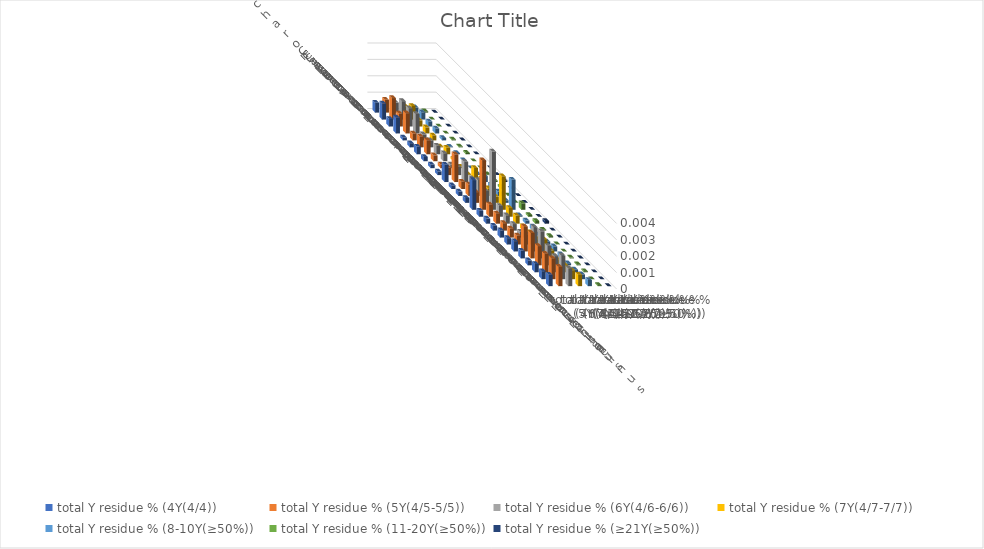
| Category | total Y residue % (4Y(4/4)) | total Y residue % (5Y(4/5-5/5)) | total Y residue % (6Y(4/6-6/6)) | total Y residue % (7Y(4/7-7/7)) | total Y residue % (8-10Y(≥50%)) | total Y residue % (11-20Y(≥50%)) | total Y residue % (≥21Y(≥50%)) |
|---|---|---|---|---|---|---|---|
| Saccharomyces cerevisiae S288c | 0.001 | 0.001 | 0.001 | 0 | 0 | 0 | 0 |
| Candida albicans | 0.001 | 0.001 | 0.001 | 0.001 | 0 | 0 | 0 |
| Candida auris | 0 | 0.001 | 0.001 | 0 | 0 | 0 | 0 |
| Candida tropicalis | 0.001 | 0.001 | 0.001 | 0 | 0 | 0 | 0 |
| Neurospora crassa | 0 | 0 | 0 | 0 | 0 | 0 | 0 |
| Magnaporthe oryzae | 0 | 0.001 | 0 | 0 | 0 | 0 | 0 |
| Trichoderma reesei | 0 | 0.001 | 0.001 | 0 | 0 | 0 | 0 |
| Cryptococcus neoformans | 0 | 0 | 0 | 0 | 0 | 0 | 0 |
| Ustilago maydis | 0 | 0 | 0 | 0 | 0 | 0 | 0 |
| Taiwanofungus camphoratus | 0 | 0 | 0.001 | 0 | 0 | 0 | 0 |
| Dictyostelium discoideum | 0.001 | 0.002 | 0.001 | 0.001 | 0 | 0 | 0 |
| Chlamydomonas reinhardtii | 0 | 0 | 0.001 | 0.001 | 0 | 0 | 0 |
| Drosophila melanogaster | 0 | 0.001 | 0.001 | 0 | 0 | 0 | 0 |
| Aedes aegypti | 0 | 0.001 | 0.001 | 0 | 0 | 0 | 0 |
| Plasmodium falciparum | 0.002 | 0.003 | 0.004 | 0.002 | 0.002 | 0 | 0 |
| Caenorhabditis elegans | 0 | 0.001 | 0.001 | 0.001 | 0 | 0 | 0 |
| Danio rerio | 0 | 0.001 | 0.001 | 0 | 0 | 0 | 0 |
| Mus musculus | 0 | 0 | 0 | 0 | 0 | 0 | 0 |
| Homo sapiens | 0 | 0.001 | 0 | 0 | 0 | 0 | 0 |
| Arabidopsis thaliana | 0 | 0.001 | 0.001 | 0 | 0 | 0 | 0 |
| Tetrahymena thermophila | 0.001 | 0.002 | 0.001 | 0.001 | 0 | 0 | 0 |
| Paramecium tetraurelia | 0 | 0.002 | 0.002 | 0 | 0 | 0 | 0 |
| Oxytricha trifallax | 0 | 0.001 | 0.001 | 0 | 0 | 0 | 0 |
| Stylonychia lemnae | 0.001 | 0.001 | 0.001 | 0 | 0 | 0 | 0 |
| Pseudocohnilembus persalinus | 0 | 0.001 | 0.001 | 0.001 | 0 | 0 | 0 |
| Stentor coeruleus | 0.001 | 0.001 | 0.001 | 0.001 | 0 | 0 | 0 |